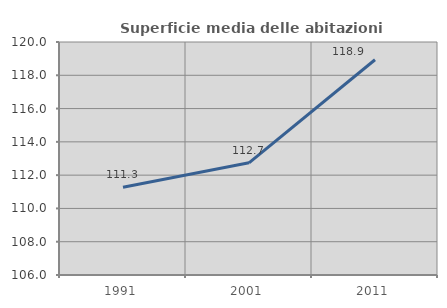
| Category | Superficie media delle abitazioni occupate |
|---|---|
| 1991.0 | 111.271 |
| 2001.0 | 112.739 |
| 2011.0 | 118.933 |